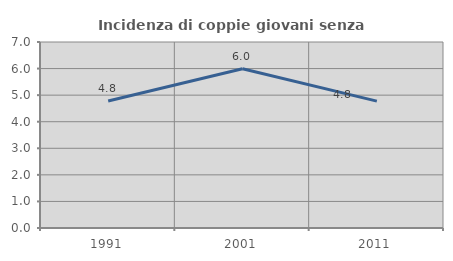
| Category | Incidenza di coppie giovani senza figli |
|---|---|
| 1991.0 | 4.778 |
| 2001.0 | 5.991 |
| 2011.0 | 4.776 |